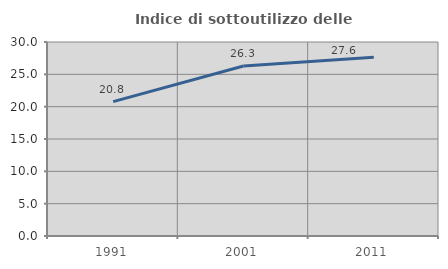
| Category | Indice di sottoutilizzo delle abitazioni  |
|---|---|
| 1991.0 | 20.777 |
| 2001.0 | 26.286 |
| 2011.0 | 27.638 |